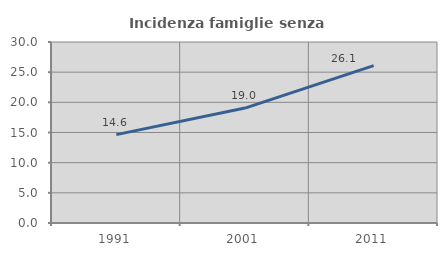
| Category | Incidenza famiglie senza nuclei |
|---|---|
| 1991.0 | 14.648 |
| 2001.0 | 19.05 |
| 2011.0 | 26.08 |